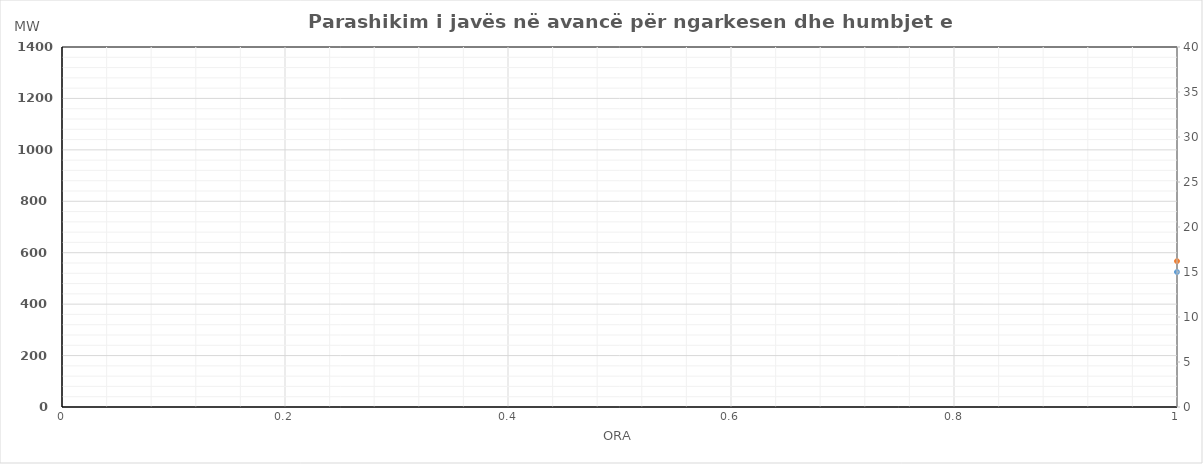
| Category | Ngarkesa (MWh) |
|---|---|
| 0 | 567.25 |
| 1 | 500.35 |
| 2 | 471.36 |
| 3 | 465.34 |
| 4 | 474.35 |
| 5 | 536.39 |
| 6 | 689.38 |
| 7 | 896.4 |
| 8 | 959.49 |
| 9 | 960.48 |
| 10 | 919.45 |
| 11 | 855.45 |
| 12 | 841.67 |
| 13 | 843.78 |
| 14 | 834.71 |
| 15 | 852.7 |
| 16 | 862.71 |
| 17 | 933.73 |
| 18 | 1085.76 |
| 19 | 1084.77 |
| 20 | 1056.77 |
| 21 | 965.78 |
| 22 | 828.78 |
| 23 | 661.81 |
| 24 | 568.26 |
| 25 | 505.27 |
| 26 | 497.28 |
| 27 | 490.3 |
| 28 | 500.26 |
| 29 | 563.28 |
| 30 | 711.21 |
| 31 | 889.19 |
| 32 | 931.09 |
| 33 | 923.15 |
| 34 | 926.15 |
| 35 | 965.21 |
| 36 | 986.23 |
| 37 | 1008.23 |
| 38 | 1016.2 |
| 39 | 982.24 |
| 40 | 1004.23 |
| 41 | 1084.39 |
| 42 | 1191.5 |
| 43 | 1206.49 |
| 44 | 1099.61 |
| 45 | 1004.66 |
| 46 | 869.69 |
| 47 | 743.66 |
| 48 | 600.54 |
| 49 | 530.58 |
| 50 | 498.58 |
| 51 | 487.58 |
| 52 | 493.57 |
| 53 | 555.61 |
| 54 | 699.54 |
| 55 | 878.53 |
| 56 | 941.61 |
| 57 | 939.58 |
| 58 | 853.61 |
| 59 | 820.6 |
| 60 | 810.66 |
| 61 | 795.73 |
| 62 | 801.7 |
| 63 | 851.64 |
| 64 | 879.68 |
| 65 | 952.7 |
| 66 | 1043.78 |
| 67 | 1051.79 |
| 68 | 1024.78 |
| 69 | 923.81 |
| 70 | 795.84 |
| 71 | 661.79 |
| 72 | 567.34 |
| 73 | 513.38 |
| 74 | 489.38 |
| 75 | 483.38 |
| 76 | 491.37 |
| 77 | 551.41 |
| 78 | 707.34 |
| 79 | 906.33 |
| 80 | 950.41 |
| 81 | 888.38 |
| 82 | 856.41 |
| 83 | 795.5 |
| 84 | 783.46 |
| 85 | 793.43 |
| 86 | 833.4 |
| 87 | 840.34 |
| 88 | 864.38 |
| 89 | 949.4 |
| 90 | 1059.48 |
| 91 | 1075.49 |
| 92 | 1051.48 |
| 93 | 947.51 |
| 94 | 813.54 |
| 95 | 676.49 |
| 96 | 549.37 |
| 97 | 488.4 |
| 98 | 464.37 |
| 99 | 508.36 |
| 100 | 492.36 |
| 101 | 537.36 |
| 102 | 670.3 |
| 103 | 846.32 |
| 104 | 875.34 |
| 105 | 855.07 |
| 106 | 809.37 |
| 107 | 759.3 |
| 108 | 752.34 |
| 109 | 734.76 |
| 110 | 753.4 |
| 111 | 769.38 |
| 112 | 794.75 |
| 113 | 894.3 |
| 114 | 1000.41 |
| 115 | 1020.4 |
| 116 | 991.52 |
| 117 | 888.64 |
| 118 | 748.34 |
| 119 | 597.28 |
| 120 | 554.46 |
| 121 | 495.57 |
| 122 | 472.58 |
| 123 | 519.6 |
| 124 | 505.56 |
| 125 | 530.58 |
| 126 | 649.51 |
| 127 | 806.49 |
| 128 | 872.49 |
| 129 | 859.45 |
| 130 | 816.45 |
| 131 | 779.61 |
| 132 | 763.63 |
| 133 | 810.63 |
| 134 | 816.6 |
| 135 | 826.64 |
| 136 | 855.63 |
| 137 | 932.69 |
| 138 | 1024.8 |
| 139 | 1052.79 |
| 140 | 1028.81 |
| 141 | 941.86 |
| 142 | 807.89 |
| 143 | 684.86 |
| 144 | 560.36 |
| 145 | 500.67 |
| 146 | 0 |
| 147 | 473.7 |
| 148 | 468.66 |
| 149 | 489.68 |
| 150 | 555.61 |
| 151 | 700.59 |
| 152 | 843.59 |
| 153 | 914.55 |
| 154 | 913.55 |
| 155 | 785.51 |
| 156 | 766.53 |
| 157 | 759.53 |
| 158 | 742.5 |
| 159 | 719.54 |
| 160 | 720.93 |
| 161 | 844.59 |
| 162 | 913.7 |
| 163 | 980.69 |
| 164 | 1040.71 |
| 165 | 968.76 |
| 166 | 821.79 |
| 167 | 641.76 |